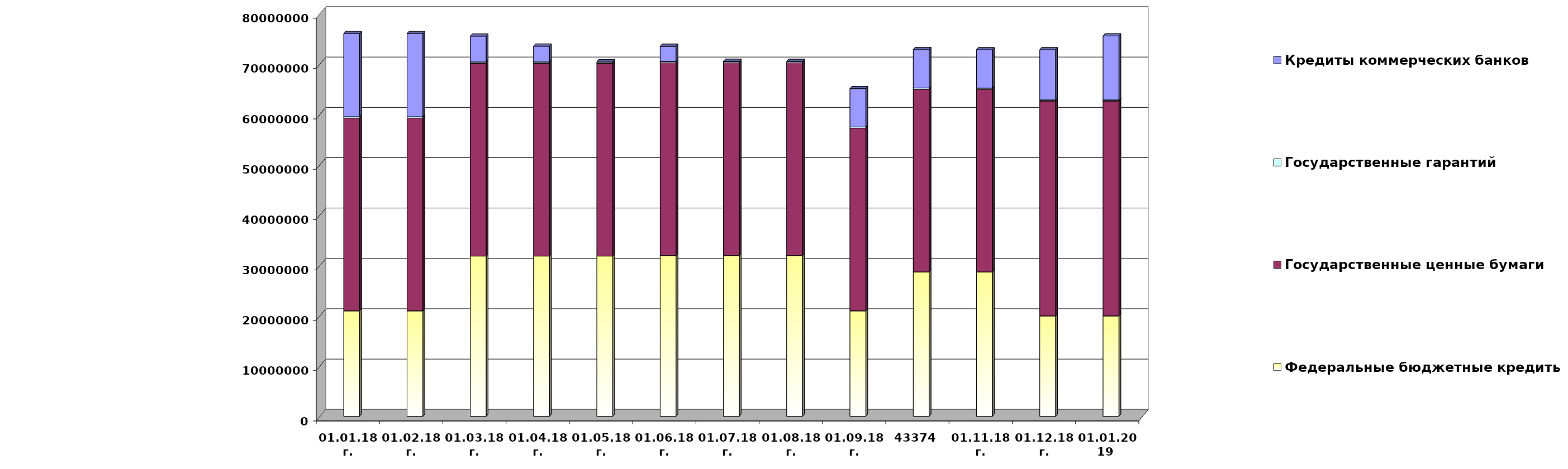
| Category | Федеральные бюджетные кредиты | Государственные ценные бумаги  | Государственные гарантий | Кредиты коммерческих банков |
|---|---|---|---|---|
| 01.01.18г. | 20959084.963 | 38300000 | 267412.82 | 16500000 |
| 01.02.18г. | 20959084.963 | 38300000 | 262100.52 | 16500000 |
| 01.03.18г. | 31846902.963 | 38300000 | 262100.52 | 5112182 |
| 01.04.18г. | 31846902.963 | 38300000 | 262100.52 | 3112182 |
| 01.05.18г. | 31846902.963 | 38300000 | 253223.16 | 0 |
| 01.06.18г. | 31945227.963 | 38300000 | 253223.16 | 3000000 |
| 01.07.18г. | 31945227.963 | 38300000 | 253223.16 | 0 |
| 01.08.18г. | 31945227.963 | 38300000 | 232477.01 | 0 |
| 01.09.18г. | 20959084.963 | 36300000 | 232477.01 | 7612182 |
| 43374 | 28702553.563 | 36300000 | 232477.01 | 7612182 |
| 01.11.18г. | 28702553.563 | 36300000 | 209872.86 | 7612182 |
| 01.12.18г. | 19957026.213 | 42700000 | 209872.86 | 9957709.35 |
| 01.01.2019 
(прогноз) | 19957026.2 | 42700000 | 209872.8 | 12690101.4 |